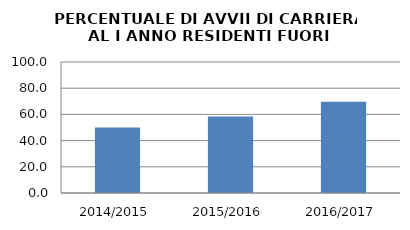
| Category | 2014/2015 2015/2016 2016/2017 |
|---|---|
| 2014/2015 | 50 |
| 2015/2016 | 58.333 |
| 2016/2017 | 69.565 |